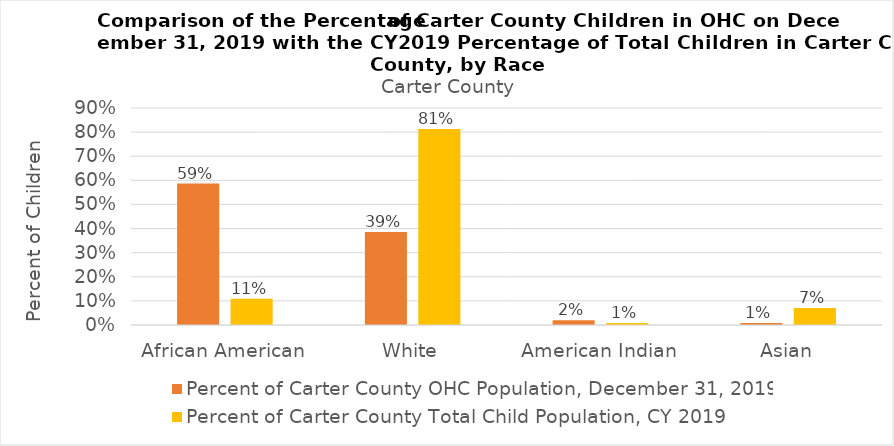
| Category | Percent of Carter County OHC Population, December 31, 2019 | Percent of Carter County Total Child Population, CY 2019 |
|---|---|---|
| African American | 0.587 | 0.109 |
| White | 0.386 | 0.813 |
| American Indian | 0.02 | 0.008 |
| Asian | 0.008 | 0.071 |